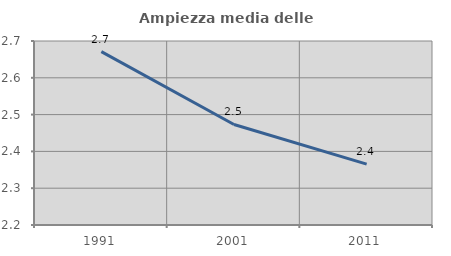
| Category | Ampiezza media delle famiglie |
|---|---|
| 1991.0 | 2.671 |
| 2001.0 | 2.473 |
| 2011.0 | 2.365 |